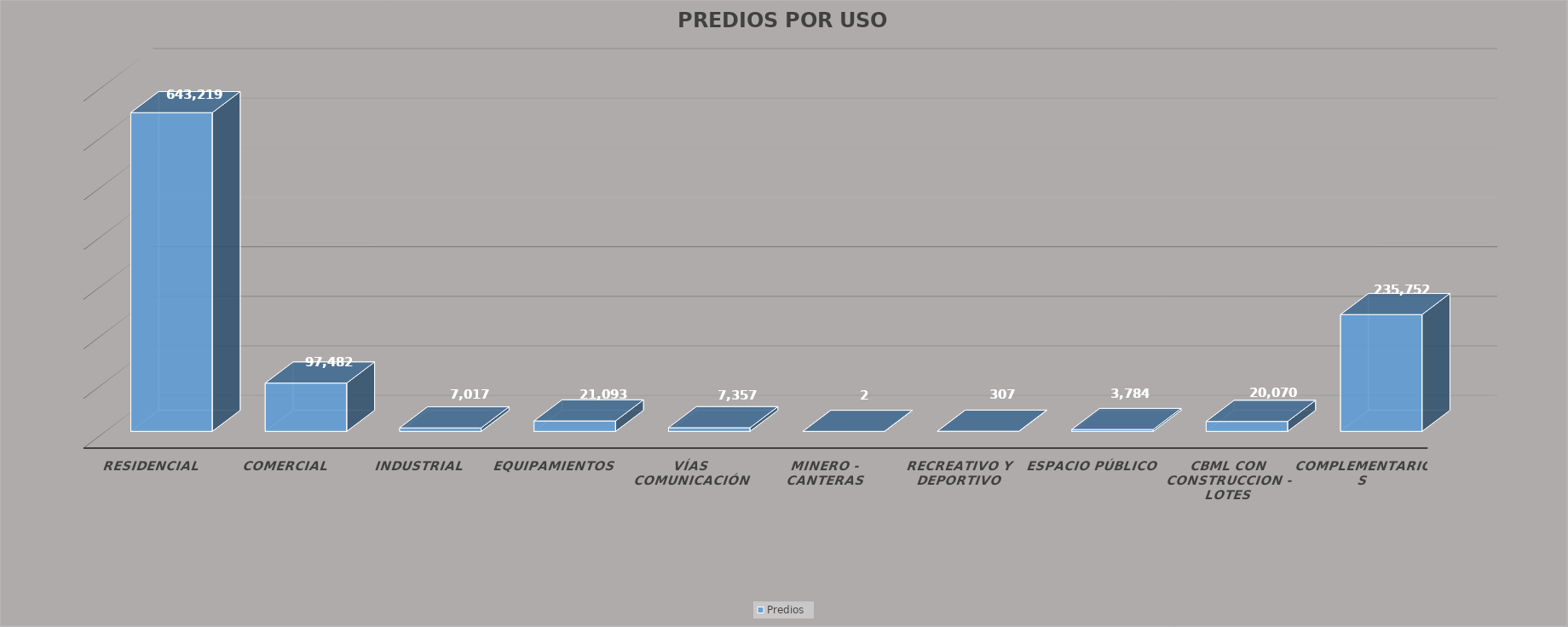
| Category | Predios |
|---|---|
| RESIDENCIAL | 643219 |
| COMERCIAL | 97482 |
| INDUSTRIAL | 7017 |
| EQUIPAMIENTOS | 21093 |
| VÍAS COMUNICACIÓN | 7357 |
| MINERO - CANTERAS | 2 |
| RECREATIVO Y DEPORTIVO | 307 |
| ESPACIO PÚBLICO | 3784 |
| CBML CON CONSTRUCCION - LOTES | 20070 |
| COMPLEMENTARIOS | 235752 |